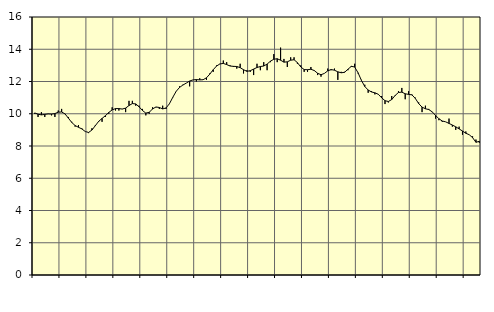
| Category | Piggar | Series 1 |
|---|---|---|
| nan | 10 | 10.05 |
| 87.0 | 9.8 | 9.97 |
| 87.0 | 10.1 | 9.93 |
| 87.0 | 9.8 | 9.96 |
| nan | 10 | 9.99 |
| 88.0 | 9.9 | 9.98 |
| 88.0 | 9.8 | 10.01 |
| 88.0 | 10.2 | 10.1 |
| nan | 10.3 | 10.11 |
| 89.0 | 10 | 9.99 |
| 89.0 | 9.8 | 9.73 |
| 89.0 | 9.5 | 9.46 |
| nan | 9.2 | 9.27 |
| 90.0 | 9.3 | 9.16 |
| 90.0 | 9.1 | 9.06 |
| 90.0 | 8.9 | 8.9 |
| nan | 8.8 | 8.84 |
| 91.0 | 9.1 | 8.99 |
| 91.0 | 9.3 | 9.26 |
| 91.0 | 9.5 | 9.53 |
| nan | 9.5 | 9.71 |
| 92.0 | 9.8 | 9.88 |
| 92.0 | 10 | 10.08 |
| 92.0 | 10.4 | 10.24 |
| nan | 10.2 | 10.32 |
| 93.0 | 10.2 | 10.32 |
| 93.0 | 10.3 | 10.29 |
| 93.0 | 10.1 | 10.35 |
| nan | 10.8 | 10.51 |
| 94.0 | 10.8 | 10.63 |
| 94.0 | 10.5 | 10.61 |
| 94.0 | 10.5 | 10.43 |
| nan | 10.3 | 10.2 |
| 95.0 | 9.9 | 10.04 |
| 95.0 | 10 | 10.09 |
| 95.0 | 10.4 | 10.3 |
| nan | 10.4 | 10.42 |
| 96.0 | 10.3 | 10.39 |
| 96.0 | 10.5 | 10.3 |
| 96.0 | 10.3 | 10.36 |
| nan | 10.6 | 10.62 |
| 97.0 | 11 | 11.02 |
| 97.0 | 11.4 | 11.39 |
| 97.0 | 11.7 | 11.63 |
| nan | 11.8 | 11.78 |
| 98.0 | 11.9 | 11.9 |
| 98.0 | 11.7 | 12.03 |
| 98.0 | 12.1 | 12.1 |
| nan | 12 | 12.12 |
| 99.0 | 12.2 | 12.1 |
| 99.0 | 12.1 | 12.11 |
| 99.0 | 12.1 | 12.23 |
| nan | 12.5 | 12.46 |
| 0.0 | 12.6 | 12.73 |
| 0.0 | 13 | 12.96 |
| 0.0 | 13.1 | 13.09 |
| nan | 13.3 | 13.12 |
| 1.0 | 13.2 | 13.05 |
| 1.0 | 13 | 12.96 |
| 1.0 | 12.9 | 12.94 |
| nan | 12.8 | 12.93 |
| 2.0 | 13.1 | 12.86 |
| 2.0 | 12.5 | 12.73 |
| 2.0 | 12.7 | 12.63 |
| nan | 12.6 | 12.67 |
| 3.0 | 12.4 | 12.77 |
| 3.0 | 13.1 | 12.87 |
| 3.0 | 12.7 | 12.93 |
| nan | 13.2 | 12.96 |
| 4.0 | 12.7 | 13.08 |
| 4.0 | 13.2 | 13.26 |
| 4.0 | 13.7 | 13.38 |
| nan | 13.2 | 13.41 |
| 5.0 | 14.1 | 13.32 |
| 5.0 | 13.4 | 13.2 |
| 5.0 | 12.9 | 13.22 |
| nan | 13.5 | 13.32 |
| 6.0 | 13.5 | 13.35 |
| 6.0 | 13.1 | 13.17 |
| 6.0 | 13 | 12.9 |
| nan | 12.6 | 12.74 |
| 7.0 | 12.6 | 12.73 |
| 7.0 | 12.9 | 12.76 |
| 7.0 | 12.7 | 12.68 |
| nan | 12.4 | 12.51 |
| 8.0 | 12.3 | 12.42 |
| 8.0 | 12.5 | 12.5 |
| 8.0 | 12.8 | 12.66 |
| nan | 12.7 | 12.74 |
| 9.0 | 12.8 | 12.7 |
| 9.0 | 12.1 | 12.6 |
| 9.0 | 12.6 | 12.54 |
| nan | 12.6 | 12.57 |
| 10.0 | 12.7 | 12.76 |
| 10.0 | 12.9 | 12.94 |
| 10.0 | 13.1 | 12.9 |
| nan | 12.5 | 12.54 |
| 11.0 | 12.1 | 12.07 |
| 11.0 | 11.8 | 11.69 |
| 11.0 | 11.3 | 11.47 |
| nan | 11.4 | 11.35 |
| 12.0 | 11.2 | 11.3 |
| 12.0 | 11.2 | 11.21 |
| 12.0 | 11.1 | 10.99 |
| nan | 10.6 | 10.81 |
| 13.0 | 10.7 | 10.76 |
| 13.0 | 11.1 | 10.88 |
| 13.0 | 11.1 | 11.13 |
| nan | 11.4 | 11.32 |
| 14.0 | 11.6 | 11.34 |
| 14.0 | 10.9 | 11.24 |
| 14.0 | 11.4 | 11.2 |
| nan | 11.2 | 11.17 |
| 15.0 | 11 | 10.95 |
| 15.0 | 10.7 | 10.63 |
| 15.0 | 10.1 | 10.41 |
| nan | 10.5 | 10.31 |
| 16.0 | 10.3 | 10.26 |
| 16.0 | 10.1 | 10.12 |
| 16.0 | 9.7 | 9.9 |
| nan | 9.6 | 9.69 |
| 17.0 | 9.5 | 9.55 |
| 17.0 | 9.5 | 9.5 |
| 17.0 | 9.7 | 9.4 |
| nan | 9.2 | 9.3 |
| 18.0 | 9 | 9.19 |
| 18.0 | 9.2 | 9.06 |
| 18.0 | 8.7 | 8.93 |
| nan | 8.9 | 8.79 |
| 19.0 | 8.7 | 8.7 |
| 19.0 | 8.6 | 8.52 |
| 19.0 | 8.4 | 8.23 |
| nan | 8.2 | 8.29 |